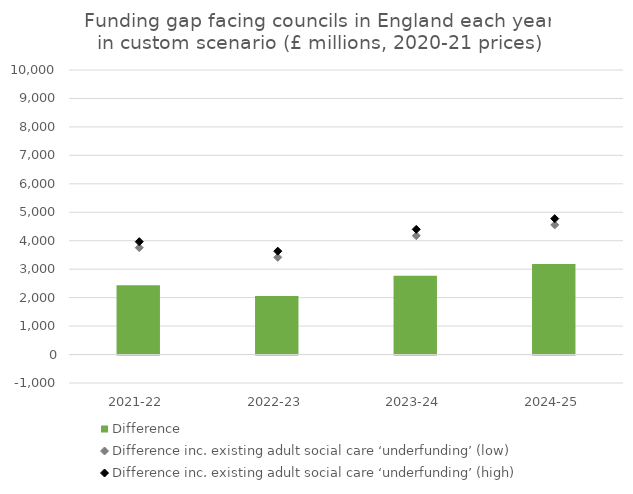
| Category | Difference |
|---|---|
| 2021-22 | 2439.424 |
| 2022-23 | 2058.854 |
| 2023-24 | 2772.829 |
| 2024-25 | 3181.16 |